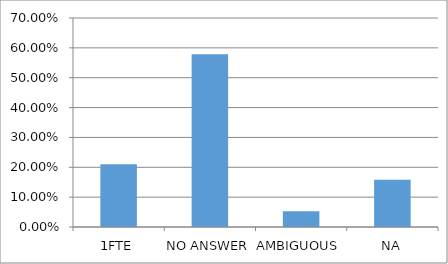
| Category | Series 0 |
|---|---|
| 1FTE | 0.211 |
| NO ANSWER | 0.579 |
| AMBIGUOUS  | 0.053 |
| NA | 0.158 |